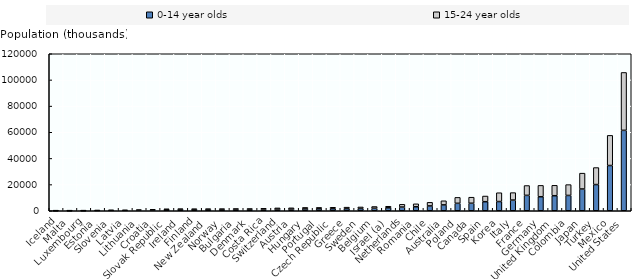
| Category | 0-14 year olds | 15-24 year olds |
|---|---|---|
| Iceland | 67.082 | 47.157 |
| Malta | 61.634 | 53.214 |
| Luxembourg | 92.82 | 69.995 |
| Estonia | 212.168 | 134.617 |
| Slovenia | 305.193 | 202.807 |
| Latvia | 301.509 | 211.793 |
| Lithuania | 427.95 | 376.381 |
| Croatia | 628.115 | 483.272 |
| Slovak Republic | 831.322 | 654.048 |
| Ireland | 1021.578 | 524.38 |
| Finland | 898.525 | 650.017 |
| New Zealand | 921.561 | 658.293 |
| Norway | 934.011 | 674.839 |
| Bulgaria | 1005.302 | 700.896 |
| Denmark | 958.156 | 749.049 |
| Costa Rica | 1072.566 | 809.903 |
| Switzerland | 1230.059 | 945.266 |
| Austria | 1225.423 | 1008.431 |
| Hungary | 1412.903 | 1142.509 |
| Portugal | 1466.595 | 1092.618 |
| Czech Republic | 1604.426 | 1070.087 |
| Greece | 1631.737 | 1125.135 |
| Sweden | 1688.811 | 1203.55 |
| Belgium | 1919.419 | 1325.25 |
| Israel (a) | 2246.719 | 1195.228 |
| Netherlands | 2838.149 | 2072.824 |
| Romania | 3064.321 | 2235.88 |
| Chile | 3701.439 | 2744.76 |
| Australia | 4482.71 | 3143.925 |
| Poland | 5695.326 | 4517.181 |
| Canada | 5744.018 | 4610.394 |
| Spain | 6916.923 | 4334.649 |
| Korea | 7034.848 | 6743.683 |
| Italy | 8167.971 | 5697.085 |
| France | 11773.194 | 7513.481 |
| Germany | 10719.049 | 8673.083 |
| United Kingdom | 11499.863 | 7954.284 |
| Colombia | 11713.193 | 8267.99 |
| Japan | 16625.509 | 12118.745 |
| Turkey | 20024.544 | 12985.384 |
| Mexico | 34585.254 | 23031.29 |
| United States | 61467.543 | 44248.884 |